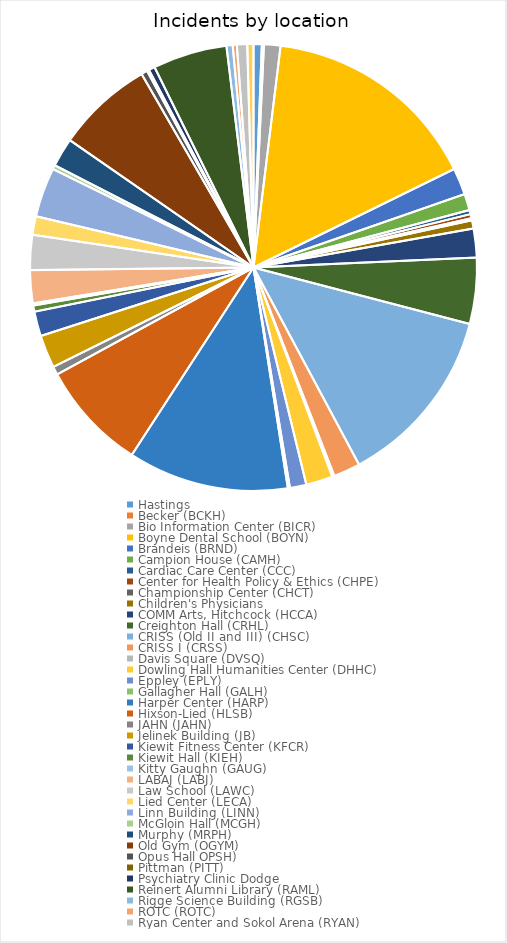
| Category | Series 0 |
|---|---|
| Hastings  | 4 |
| Becker (BCKH)  | 1 |
| Bio Information Center (BICR)  | 8 |
| Boyne Dental School (BOYN)  | 106 |
| Brandeis (BRND)  | 13 |
| Campion House (CAMH)  | 8 |
| Cardiac Care Center (CCC)  | 2 |
| Center for Health Policy & Ethics (CHPE)  | 2 |
| Championship Center (CHCT)  | 1 |
| Children's Physicians  | 4 |
| COMM Arts, Hitchcock (HCCA)  | 14 |
| Creighton Hall (CRHL)  | 32 |
| CRISS (Old II and III) (CHSC)  | 88 |
| CRISS I (CRSS)  | 13 |
| Davis Square (DVSQ)  | 1 |
| Dowling Hall Humanities Center (DHHC)  | 13 |
| Eppley (EPLY)  | 8 |
| Gallagher Hall (GALH) | 1 |
| Harper Center (HARP)  | 78 |
| Hixson-Lied (HLSB)  | 53 |
| JAHN (JAHN)  | 4 |
| Jelinek Building (JB)  | 16 |
| Kiewit Fitness Center (KFCR)  | 12 |
| Kiewit Hall (KIEH)  | 3 |
| Kitty Gaughn (GAUG) | 1 |
| LABAJ (LABJ)  | 16 |
| Law School (LAWC)  | 17 |
| Lied Center (LECA)  | 9 |
| Linn Building (LINN)  | 24 |
| McGloin Hall (MCGH)  | 2 |
| Murphy (MRPH)  | 14 |
| Old Gym (OGYM)  | 47 |
| Opus Hall OPSH) | 3 |
| Pittman (PITT)  | 1 |
| Psychiatry Clinic Dodge | 3 |
| Reinert Alumni Library (RAML)  | 36 |
| Rigge Science Building (RGSB)  | 3 |
| ROTC (ROTC)  | 2 |
| Ryan Center and Sokol Arena (RYAN)  | 5 |
| Saint John's Church (STJC)  | 3 |